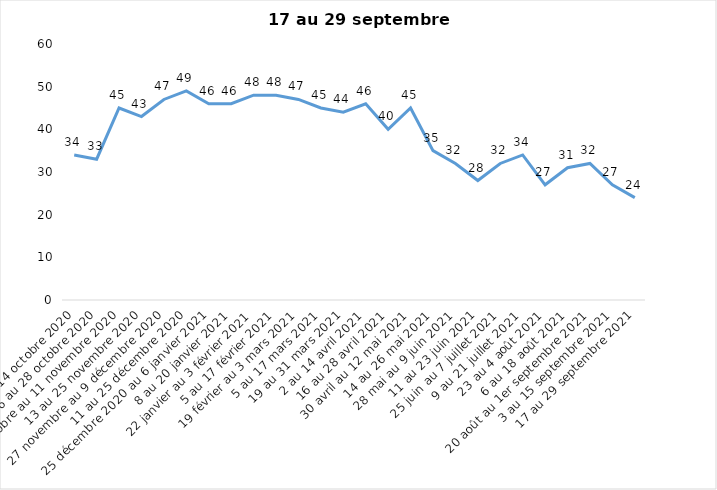
| Category | Toujours aux trois mesures |
|---|---|
| 2 au 14 octobre 2020 | 34 |
| 16 au 28 octobre 2020 | 33 |
| 30 octobre au 11 novembre 2020 | 45 |
| 13 au 25 novembre 2020 | 43 |
| 27 novembre au 9 décembre 2020 | 47 |
| 11 au 25 décembre 2020 | 49 |
| 25 décembre 2020 au 6 janvier 2021 | 46 |
| 8 au 20 janvier 2021 | 46 |
| 22 janvier au 3 février 2021 | 48 |
| 5 au 17 février 2021 | 48 |
| 19 février au 3 mars 2021 | 47 |
| 5 au 17 mars 2021 | 45 |
| 19 au 31 mars 2021 | 44 |
| 2 au 14 avril 2021 | 46 |
| 16 au 28 avril 2021 | 40 |
| 30 avril au 12 mai 2021 | 45 |
| 14 au 26 mai 2021 | 35 |
| 28 mai au 9 juin 2021 | 32 |
| 11 au 23 juin 2021 | 28 |
| 25 juin au 7 juillet 2021 | 32 |
| 9 au 21 juillet 2021 | 34 |
| 23 au 4 août 2021 | 27 |
| 6 au 18 août 2021 | 31 |
| 20 août au 1er septembre 2021 | 32 |
| 3 au 15 septembre 2021 | 27 |
| 17 au 29 septembre 2021 | 24 |